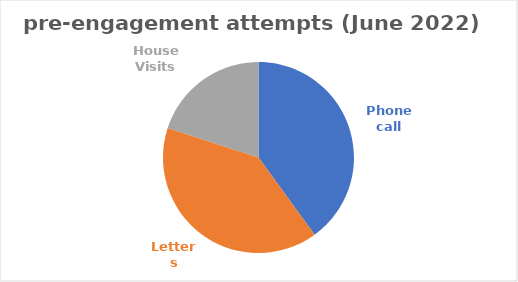
| Category | Series 0 |
|---|---|
| Phone call | 2 |
| Letters | 2 |
| House Visits | 1 |